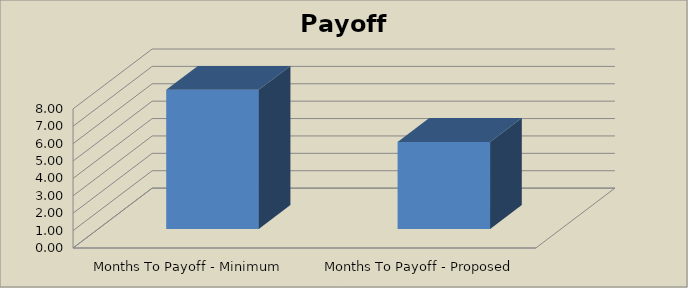
| Category | Series 0 |
|---|---|
| Months To Payoff - Minimum Payment | 8 |
| Months To Payoff - Proposed Payment | 5 |